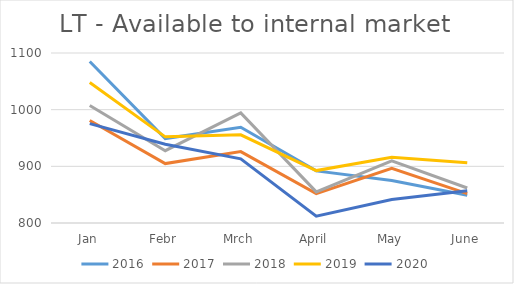
| Category | 2016 | 2017 | 2018 | 2019 | 2020 |
|---|---|---|---|---|---|
| Jan | 1085 | 980.897 | 1007.459 | 1047.997 | 975.391 |
| Febr | 949 | 904.876 | 927.635 | 952.035 | 939.05 |
| Mrch | 969 | 925.929 | 994.229 | 955.649 | 913.318 |
| April | 892 | 851.953 | 854.897 | 892.476 | 812.166 |
| May | 875 | 896.462 | 909.707 | 916.122 | 841.285 |
| June | 849 | 851.86 | 861.701 | 906.327 | 857.039 |